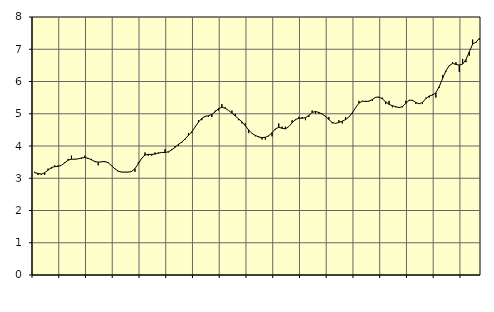
| Category | Piggar | Information och kommunikation, SNI 58-63 |
|---|---|---|
| nan | 3.2 | 3.17 |
| 87.0 | 3.1 | 3.15 |
| 87.0 | 3.1 | 3.13 |
| 87.0 | 3.1 | 3.17 |
| nan | 3.3 | 3.25 |
| 88.0 | 3.3 | 3.33 |
| 88.0 | 3.4 | 3.36 |
| 88.0 | 3.4 | 3.37 |
| nan | 3.4 | 3.4 |
| 89.0 | 3.5 | 3.48 |
| 89.0 | 3.6 | 3.56 |
| 89.0 | 3.7 | 3.59 |
| nan | 3.6 | 3.59 |
| 90.0 | 3.6 | 3.6 |
| 90.0 | 3.6 | 3.63 |
| 90.0 | 3.7 | 3.64 |
| nan | 3.6 | 3.62 |
| 91.0 | 3.6 | 3.57 |
| 91.0 | 3.5 | 3.52 |
| 91.0 | 3.4 | 3.5 |
| nan | 3.5 | 3.51 |
| 92.0 | 3.5 | 3.52 |
| 92.0 | 3.5 | 3.48 |
| 92.0 | 3.4 | 3.39 |
| nan | 3.3 | 3.29 |
| 93.0 | 3.2 | 3.22 |
| 93.0 | 3.2 | 3.19 |
| 93.0 | 3.2 | 3.19 |
| nan | 3.2 | 3.19 |
| 94.0 | 3.2 | 3.21 |
| 94.0 | 3.2 | 3.3 |
| 94.0 | 3.5 | 3.45 |
| nan | 3.6 | 3.62 |
| 95.0 | 3.8 | 3.72 |
| 95.0 | 3.7 | 3.74 |
| 95.0 | 3.7 | 3.74 |
| nan | 3.8 | 3.75 |
| 96.0 | 3.8 | 3.78 |
| 96.0 | 3.8 | 3.8 |
| 96.0 | 3.9 | 3.8 |
| nan | 3.8 | 3.82 |
| 97.0 | 3.9 | 3.88 |
| 97.0 | 4 | 3.96 |
| 97.0 | 4 | 4.05 |
| nan | 4.1 | 4.12 |
| 98.0 | 4.2 | 4.22 |
| 98.0 | 4.4 | 4.33 |
| 98.0 | 4.4 | 4.44 |
| nan | 4.6 | 4.59 |
| 99.0 | 4.8 | 4.74 |
| 99.0 | 4.8 | 4.86 |
| 99.0 | 4.9 | 4.92 |
| nan | 4.9 | 4.94 |
| 0.0 | 4.9 | 4.98 |
| 0.0 | 5.1 | 5.06 |
| 0.0 | 5.1 | 5.16 |
| nan | 5.3 | 5.2 |
| 1.0 | 5.2 | 5.17 |
| 1.0 | 5.1 | 5.1 |
| 1.0 | 5.1 | 5.02 |
| nan | 5 | 4.93 |
| 2.0 | 4.8 | 4.84 |
| 2.0 | 4.7 | 4.75 |
| 2.0 | 4.7 | 4.63 |
| nan | 4.4 | 4.5 |
| 3.0 | 4.4 | 4.39 |
| 3.0 | 4.3 | 4.33 |
| 3.0 | 4.3 | 4.28 |
| nan | 4.2 | 4.26 |
| 4.0 | 4.2 | 4.27 |
| 4.0 | 4.3 | 4.32 |
| 4.0 | 4.3 | 4.41 |
| nan | 4.5 | 4.53 |
| 5.0 | 4.7 | 4.58 |
| 5.0 | 4.6 | 4.55 |
| 5.0 | 4.6 | 4.53 |
| nan | 4.6 | 4.6 |
| 6.0 | 4.8 | 4.72 |
| 6.0 | 4.8 | 4.82 |
| 6.0 | 4.9 | 4.86 |
| nan | 4.9 | 4.86 |
| 7.0 | 4.8 | 4.88 |
| 7.0 | 4.9 | 4.95 |
| 7.0 | 5.1 | 5.04 |
| nan | 5 | 5.07 |
| 8.0 | 5 | 5.04 |
| 8.0 | 5 | 4.99 |
| 8.0 | 4.9 | 4.92 |
| nan | 4.9 | 4.82 |
| 9.0 | 4.7 | 4.73 |
| 9.0 | 4.7 | 4.7 |
| 9.0 | 4.8 | 4.73 |
| nan | 4.7 | 4.77 |
| 10.0 | 4.9 | 4.82 |
| 10.0 | 4.9 | 4.9 |
| 10.0 | 5 | 5.03 |
| nan | 5.2 | 5.19 |
| 11.0 | 5.4 | 5.33 |
| 11.0 | 5.4 | 5.39 |
| 11.0 | 5.4 | 5.38 |
| nan | 5.4 | 5.39 |
| 12.0 | 5.4 | 5.44 |
| 12.0 | 5.5 | 5.51 |
| 12.0 | 5.5 | 5.52 |
| nan | 5.5 | 5.46 |
| 13.0 | 5.3 | 5.37 |
| 13.0 | 5.4 | 5.29 |
| 13.0 | 5.2 | 5.25 |
| nan | 5.2 | 5.22 |
| 14.0 | 5.2 | 5.19 |
| 14.0 | 5.2 | 5.22 |
| 14.0 | 5.4 | 5.32 |
| nan | 5.4 | 5.42 |
| 15.0 | 5.4 | 5.42 |
| 15.0 | 5.3 | 5.35 |
| 15.0 | 5.3 | 5.31 |
| nan | 5.3 | 5.35 |
| 16.0 | 5.5 | 5.47 |
| 16.0 | 5.5 | 5.55 |
| 16.0 | 5.6 | 5.58 |
| nan | 5.5 | 5.65 |
| 17.0 | 5.8 | 5.84 |
| 17.0 | 6.2 | 6.09 |
| 17.0 | 6.3 | 6.33 |
| nan | 6.5 | 6.49 |
| 18.0 | 6.6 | 6.56 |
| 18.0 | 6.6 | 6.53 |
| 18.0 | 6.3 | 6.51 |
| nan | 6.7 | 6.54 |
| 19.0 | 6.6 | 6.68 |
| 19.0 | 6.8 | 6.92 |
| 19.0 | 7.3 | 7.16 |
| nan | 7.2 | 7.22 |
| 20.0 | 7.3 | 7.34 |